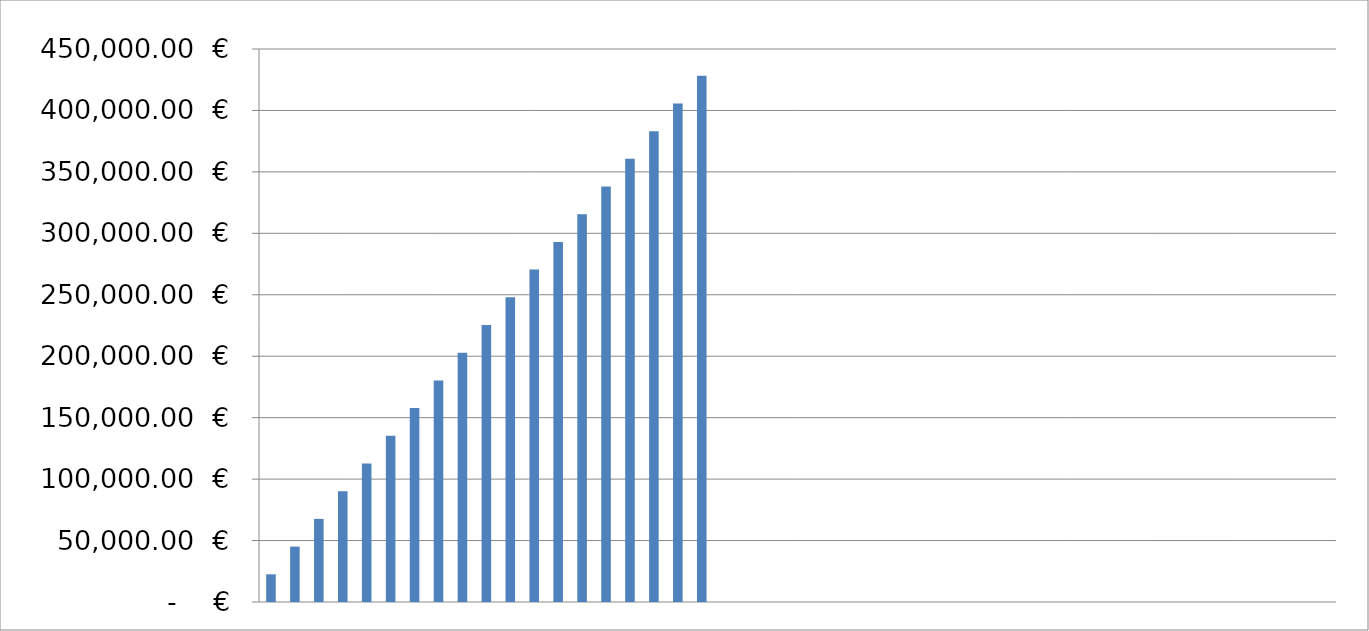
| Category | Gains potentiels cumulés en Euros par point gagné |
|---|---|
| 1.0 | 22539 |
| 2.0 | 45078 |
| 3.0 | 67617 |
| 4.0 | 90156 |
| 5.0 | 112695 |
| 6.0 | 135234 |
| 7.0 | 157773 |
| 8.0 | 180312 |
| 9.0 | 202851 |
| 10.0 | 225390 |
| 11.0 | 247929 |
| 12.0 | 270468 |
| 13.0 | 293007 |
| 14.0 | 315546 |
| 15.0 | 338085 |
| 16.0 | 360624 |
| 0.0 | 383163 |
| 0.0 | 405702 |
| 0.0 | 428241 |
| 0.0 | 0 |
| 0.0 | 0 |
| 0.0 | 0 |
| 0.0 | 0 |
| 0.0 | 0 |
| 0.0 | 0 |
| 0.0 | 0 |
| 0.0 | 0 |
| 0.0 | 0 |
| 0.0 | 0 |
| 0.0 | 0 |
| 0.0 | 0 |
| 0.0 | 0 |
| 0.0 | 0 |
| 0.0 | 0 |
| 0.0 | 0 |
| 0.0 | 0 |
| 0.0 | 0 |
| 0.0 | 0 |
| 0.0 | 0 |
| 0.0 | 0 |
| 0.0 | 0 |
| 0.0 | 0 |
| 0.0 | 0 |
| 0.0 | 0 |
| 0.0 | 0 |